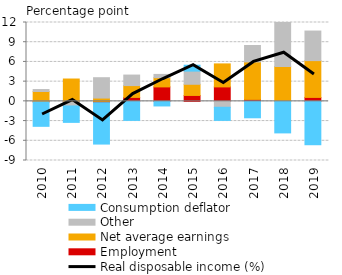
| Category | Employment | Net average earnings | Other | Consumption deflator |
|---|---|---|---|---|
| 2010.0 | -0.1 | 1.5 | 0.3 | -3.7 |
| 2011.0 | -0.1 | 3.4 | -0.6 | -2.5 |
| 2012.0 | -0.2 | 0.5 | 3.1 | -6.3 |
| 2013.0 | 0.6 | 1.8 | 1.6 | -2.9 |
| 2014.0 | 2.2 | 1.4 | 0.5 | -0.7 |
| 2015.0 | 0.9 | 1.7 | 2 | 0.9 |
| 2016.0 | 2.2 | 3.5 | -0.9 | -2 |
| 2017.0 | 0.3 | 5.7 | 2.5 | -2.5 |
| 2018.0 | 0 | 5.3 | 6.9 | -4.8 |
| 2019.0 | 0.6 | 5.6 | 4.5 | -6.6 |